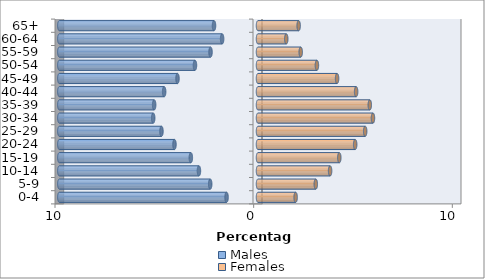
| Category | Males | Females |
|---|---|---|
| 0-4 | -1.583 | 1.894 |
| 5-9 | -2.406 | 2.909 |
| 10-14 | -2.973 | 3.629 |
| 15-19 | -3.381 | 4.092 |
| 20-24 | -4.204 | 4.892 |
| 25-29 | -4.86 | 5.395 |
| 30-34 | -5.275 | 5.787 |
| 35-39 | -5.227 | 5.627 |
| 40-44 | -4.724 | 4.94 |
| 45-49 | -4.052 | 3.98 |
| 50-54 | -3.173 | 2.965 |
| 55-59 | -2.39 | 2.15 |
| 60-64 | -1.806 | 1.423 |
| 65+ | -2.214 | 2.046 |